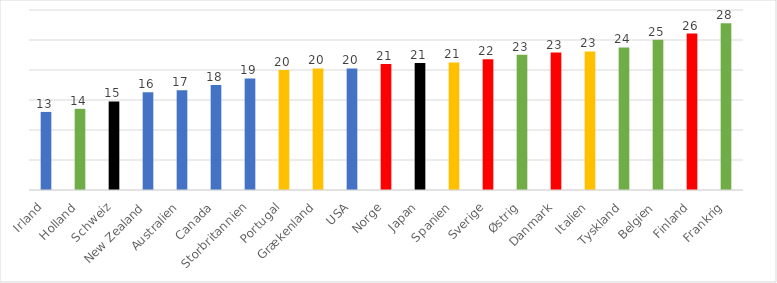
| Category | Offentlige nettoudgifter til velfærd |
|---|---|
| Irland | 13.014 |
| Holland | 13.53 |
| Schweiz | 14.754 |
| New Zealand | 16.301 |
| Australien | 16.624 |
| Canada | 17.51 |
| Storbritannien | 18.604 |
| Portugal | 20.014 |
| Grækenland | 20.254 |
| USA | 20.269 |
| Norge | 20.98 |
| Japan | 21.184 |
| Spanien | 21.261 |
| Sverige | 21.781 |
| Østrig | 22.531 |
| Danmark | 22.912 |
| Italien | 23.088 |
| Tyskland | 23.757 |
| Belgien | 25.046 |
| Finland | 26.064 |
| Frankrig | 27.809 |